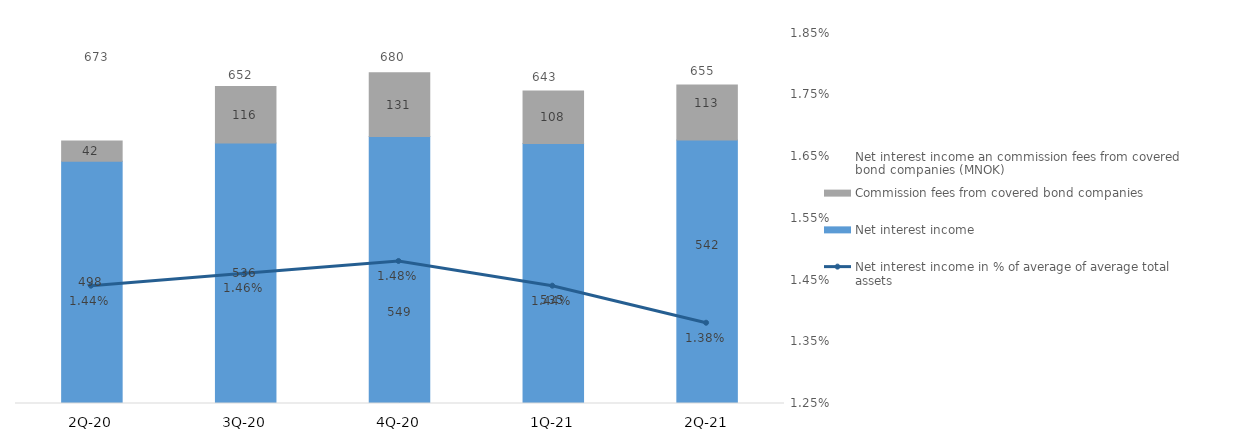
| Category | Net interest income | Commission fees from covered bond companies |
|---|---|---|
| 2Q-21 | 541.898 | 113.288 |
| 1Q-21 | 534.886 | 107.955 |
| 4Q-20 | 549.138 | 131.015 |
| 3Q-20 | 535.786 | 116.034 |
| 2Q-20 | 498.097 | 41.55 |